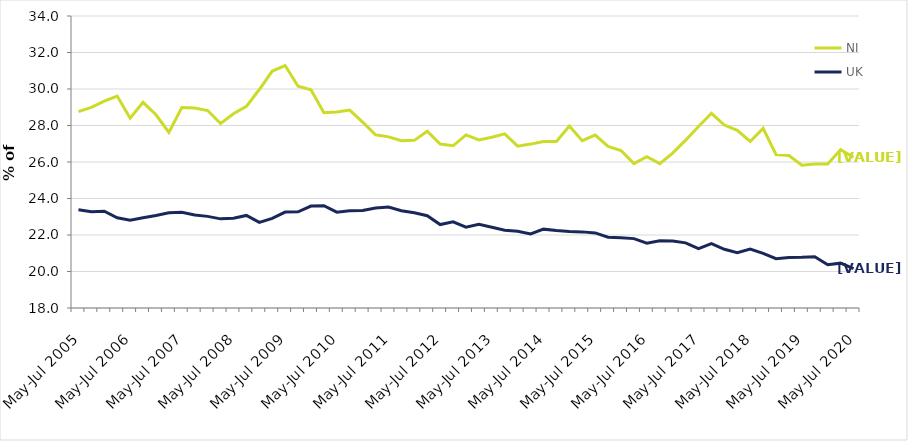
| Category | NI | UK |
|---|---|---|
| May-Jul 2005 | 28.762 | 23.388 |
| Aug-Oct 2005 | 28.995 | 23.272 |
| Nov-Jan 2006 | 29.332 | 23.304 |
| Feb-Apr 2006 | 29.612 | 22.942 |
| May-Jul 2006 | 28.4 | 22.812 |
| Aug-Oct 2006 | 29.27 | 22.94 |
| Nov-Jan 2007 | 28.588 | 23.068 |
| Feb-Apr 2007 | 27.617 | 23.213 |
| May-Jul 2007 | 28.988 | 23.241 |
| Aug-Oct 2007 | 28.956 | 23.1 |
| Nov-Jan 2008 | 28.821 | 23.021 |
| Feb-Apr 2008 | 28.11 | 22.885 |
| May-Jul 2008 | 28.646 | 22.919 |
| Aug-Oct 2008 | 29.05 | 23.071 |
| Nov-Jan 2009 | 29.973 | 22.695 |
| Feb-Apr 2009 | 30.984 | 22.908 |
| May-Jul 2009 | 31.286 | 23.255 |
| Aug-Oct 2009 | 30.153 | 23.274 |
| Nov-Jan 2010 | 29.959 | 23.587 |
| Feb-Apr 2010 | 28.705 | 23.606 |
| May-Jul 2010 | 28.743 | 23.252 |
| Aug-Oct 2010 | 28.847 | 23.329 |
| Nov-Jan 2011 | 28.18 | 23.34 |
| Feb-Apr 2011 | 27.489 | 23.483 |
| May-Jul 2011 | 27.377 | 23.531 |
| Aug-Oct 2011 | 27.166 | 23.331 |
| Nov-Jan 2012 | 27.186 | 23.22 |
| Feb-Apr 2012 | 27.689 | 23.059 |
| May-Jul 2012 | 26.987 | 22.571 |
| Aug-Oct 2012 | 26.889 | 22.723 |
| Nov-Jan 2013 | 27.482 | 22.425 |
| Feb-Apr 2013 | 27.21 | 22.581 |
| May-Jul 2013 | 27.354 | 22.426 |
| Aug-Oct 2013 | 27.54 | 22.259 |
| Nov-Jan 2014 | 26.87 | 22.208 |
| Feb-Apr 2014 | 26.981 | 22.061 |
| May-Jul 2014 | 27.124 | 22.321 |
| Aug-Oct 2014 | 27.129 | 22.242 |
| Nov-Jan 2015 | 27.967 | 22.193 |
| Feb-Apr 2015 | 27.171 | 22.171 |
| May-Jul 2015 | 27.477 | 22.116 |
| Aug-Oct 2015 | 26.855 | 21.877 |
| Nov-Jan 2016 | 26.633 | 21.845 |
| Feb-Apr 2016 | 25.909 | 21.802 |
| May-Jul 2016 | 26.289 | 21.555 |
| Aug-Oct 2016 | 25.912 | 21.681 |
| Nov-Jan 2017 | 26.491 | 21.675 |
| Feb-Apr 2017 | 27.196 | 21.569 |
| May-Jul 2017 | 27.942 | 21.257 |
| Aug-Oct 2017 | 28.67 | 21.525 |
| Nov-Jan 2018 | 28.024 | 21.217 |
| Feb-Apr 2018 | 27.736 | 21.024 |
| May-Jul 2018 | 27.123 | 21.23 |
| Aug-Oct 2018 | 27.845 | 20.997 |
| Nov-Jan 2019 | 26.406 | 20.704 |
| Feb-Apr 2019 | 26.357 | 20.771 |
| May-Jul 2019 | 25.826 | 20.776 |
| Aug-Oct 2019 | 25.894 | 20.809 |
| Nov-Jan 2020 | 25.896 | 20.374 |
| Feb-Apr 2020 | 26.679 | 20.457 |
| May-Jul 2020 | 26.257 | 20.159 |